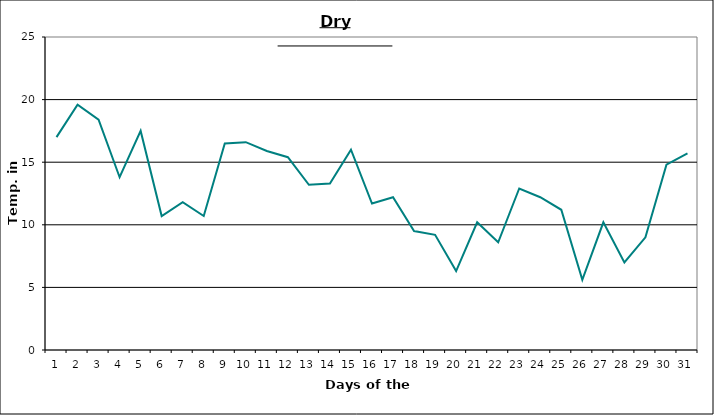
| Category | Series 0 |
|---|---|
| 0 | 17 |
| 1 | 19.6 |
| 2 | 18.4 |
| 3 | 13.8 |
| 4 | 17.5 |
| 5 | 10.7 |
| 6 | 11.8 |
| 7 | 10.7 |
| 8 | 16.5 |
| 9 | 16.6 |
| 10 | 15.9 |
| 11 | 15.4 |
| 12 | 13.2 |
| 13 | 13.3 |
| 14 | 16 |
| 15 | 11.7 |
| 16 | 12.2 |
| 17 | 9.5 |
| 18 | 9.2 |
| 19 | 6.3 |
| 20 | 10.2 |
| 21 | 8.6 |
| 22 | 12.9 |
| 23 | 12.2 |
| 24 | 11.2 |
| 25 | 5.6 |
| 26 | 10.2 |
| 27 | 7 |
| 28 | 9 |
| 29 | 14.8 |
| 30 | 15.7 |